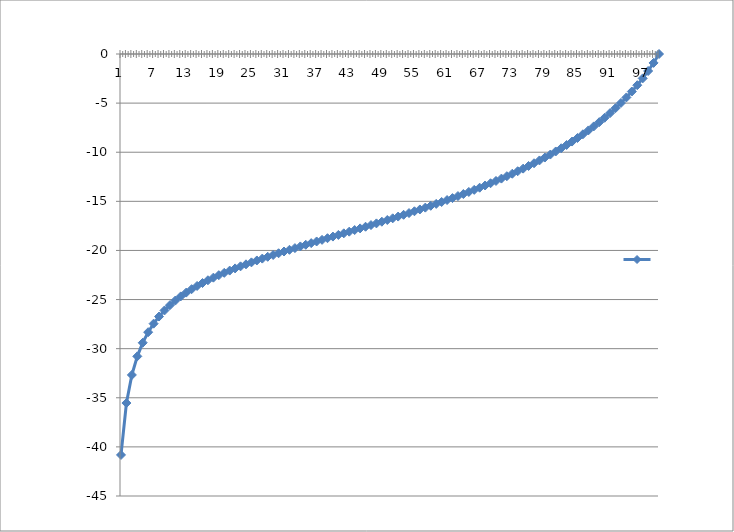
| Category | Series 0 |
|---|---|
| 0 | -40.82 |
| 1 | -35.534 |
| 2 | -32.676 |
| 3 | -30.782 |
| 4 | -29.396 |
| 5 | -28.322 |
| 6 | -27.453 |
| 7 | -26.729 |
| 8 | -26.112 |
| 9 | -25.575 |
| 10 | -25.101 |
| 11 | -24.677 |
| 12 | -24.293 |
| 13 | -23.942 |
| 14 | -23.618 |
| 15 | -23.317 |
| 16 | -23.035 |
| 17 | -22.77 |
| 18 | -22.518 |
| 19 | -22.279 |
| 20 | -22.05 |
| 21 | -21.83 |
| 22 | -21.618 |
| 23 | -21.413 |
| 24 | -21.214 |
| 25 | -21.02 |
| 26 | -20.831 |
| 27 | -20.645 |
| 28 | -20.464 |
| 29 | -20.285 |
| 30 | -20.109 |
| 31 | -19.935 |
| 32 | -19.763 |
| 33 | -19.592 |
| 34 | -19.423 |
| 35 | -19.255 |
| 36 | -19.087 |
| 37 | -18.921 |
| 38 | -18.754 |
| 39 | -18.588 |
| 40 | -18.422 |
| 41 | -18.256 |
| 42 | -18.09 |
| 43 | -17.923 |
| 44 | -17.755 |
| 45 | -17.586 |
| 46 | -17.417 |
| 47 | -17.247 |
| 48 | -17.075 |
| 49 | -16.902 |
| 50 | -16.727 |
| 51 | -16.551 |
| 52 | -16.373 |
| 53 | -16.194 |
| 54 | -16.012 |
| 55 | -15.828 |
| 56 | -15.641 |
| 57 | -15.453 |
| 58 | -15.261 |
| 59 | -15.067 |
| 60 | -14.869 |
| 61 | -14.669 |
| 62 | -14.465 |
| 63 | -14.257 |
| 64 | -14.046 |
| 65 | -13.831 |
| 66 | -13.611 |
| 67 | -13.387 |
| 68 | -13.159 |
| 69 | -12.925 |
| 70 | -12.686 |
| 71 | -12.442 |
| 72 | -12.192 |
| 73 | -11.935 |
| 74 | -11.672 |
| 75 | -11.401 |
| 76 | -11.123 |
| 77 | -10.837 |
| 78 | -10.542 |
| 79 | -10.238 |
| 80 | -9.924 |
| 81 | -9.599 |
| 82 | -9.262 |
| 83 | -8.914 |
| 84 | -8.551 |
| 85 | -8.174 |
| 86 | -7.781 |
| 87 | -7.371 |
| 88 | -6.941 |
| 89 | -6.49 |
| 90 | -6.016 |
| 91 | -5.515 |
| 92 | -4.985 |
| 93 | -4.422 |
| 94 | -3.821 |
| 95 | -3.177 |
| 96 | -2.483 |
| 97 | -1.73 |
| 98 | -0.907 |
| 99 | 0 |